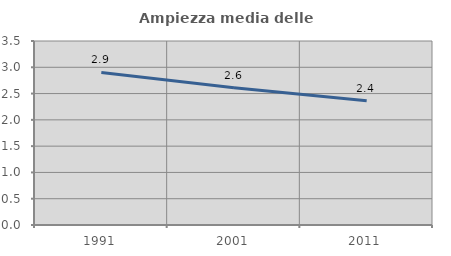
| Category | Ampiezza media delle famiglie |
|---|---|
| 1991.0 | 2.901 |
| 2001.0 | 2.611 |
| 2011.0 | 2.363 |